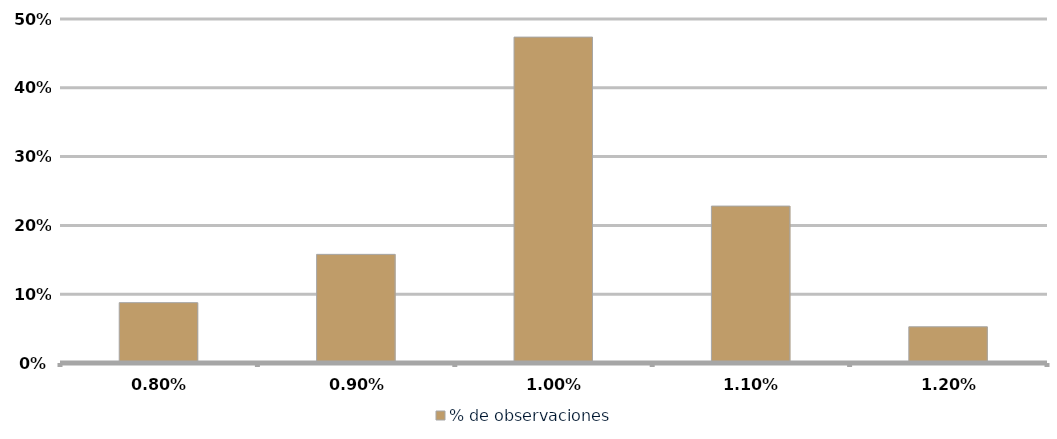
| Category | % de observaciones  |
|---|---|
| 0.008 | 0.088 |
| 0.009000000000000001 | 0.158 |
| 0.01 | 0.474 |
| 0.011 | 0.228 |
| 0.012 | 0.053 |